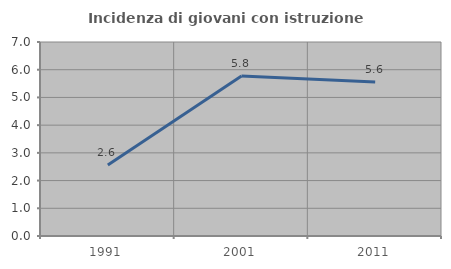
| Category | Incidenza di giovani con istruzione universitaria |
|---|---|
| 1991.0 | 2.564 |
| 2001.0 | 5.769 |
| 2011.0 | 5.556 |